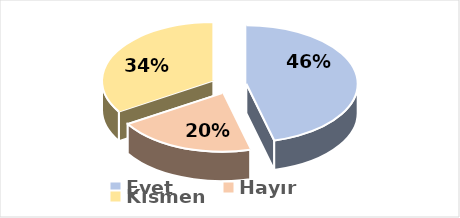
| Category | Evet |
|---|---|
| Evet | 0.46 |
| Hayır | 0.202 |
| Kısmen | 0.339 |